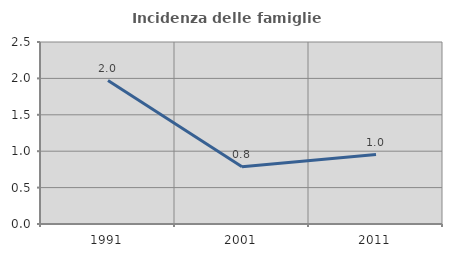
| Category | Incidenza delle famiglie numerose |
|---|---|
| 1991.0 | 1.97 |
| 2001.0 | 0.786 |
| 2011.0 | 0.954 |